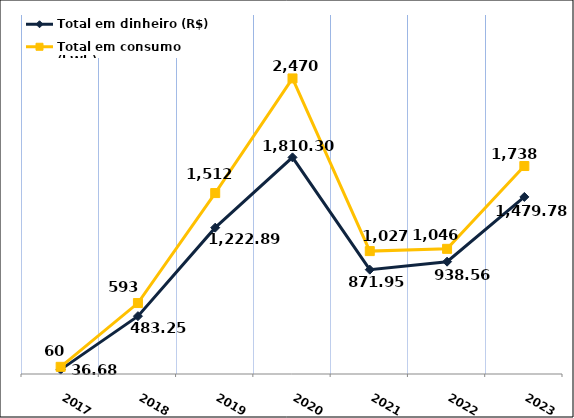
| Category | Total em dinheiro (R$) |
|---|---|
| 2017.0 | 36.68 |
| 2018.0 | 483.25 |
| 2019.0 | 1222.89 |
| 2020.0 | 1810.3 |
| 2021.0 | 871.95 |
| 2022.0 | 938.56 |
| 2023.0 | 1479.78 |